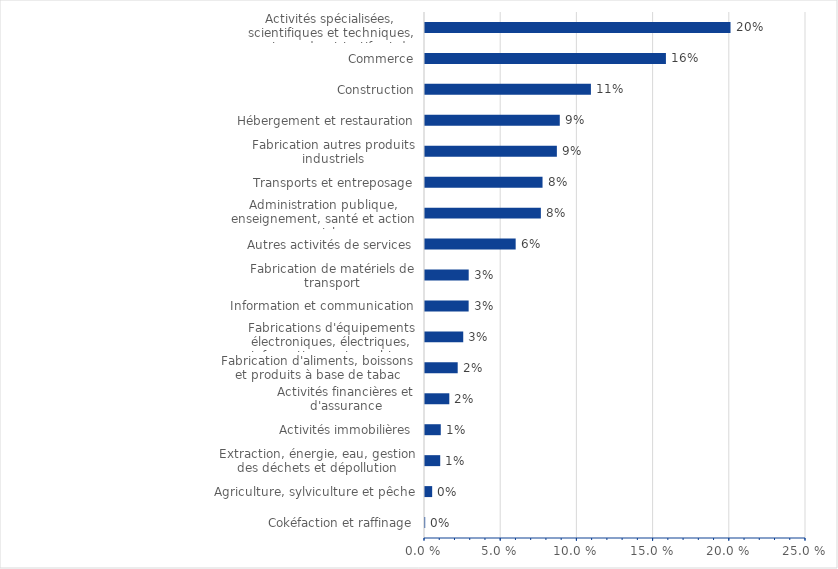
| Category | Series 0 |
|---|---|
| Cokéfaction et raffinage | 0 |
| Agriculture, sylviculture et pêche | 0.005 |
| Extraction, énergie, eau, gestion des déchets et dépollution | 0.01 |
| Activités immobilières | 0.01 |
| Activités financières et d'assurance | 0.016 |
| Fabrication d'aliments, boissons et produits à base de tabac | 0.021 |
| Fabrications d'équipements électroniques, électriques, informatiques et machines | 0.025 |
| Information et communication | 0.029 |
| Fabrication de matériels de transport | 0.029 |
| Autres activités de services | 0.059 |
| Administration publique, enseignement, santé et action sociale | 0.076 |
| Transports et entreposage | 0.077 |
| Fabrication autres produits industriels | 0.087 |
| Hébergement et restauration | 0.088 |
| Construction | 0.109 |
| Commerce | 0.158 |
| Activités spécialisées, scientifiques et techniques, services admnistratifs et de soutien | 0.2 |